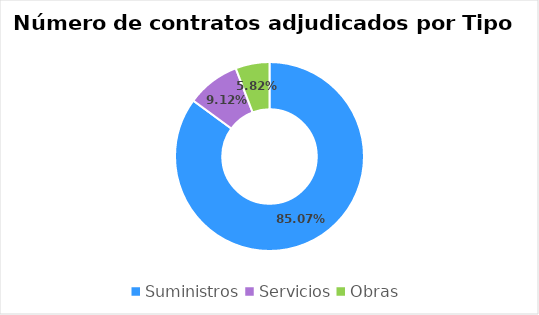
| Category | Series 0 |
|---|---|
| Suministros | 0.851 |
| Servicios | 0.091 |
| Obras | 0.058 |